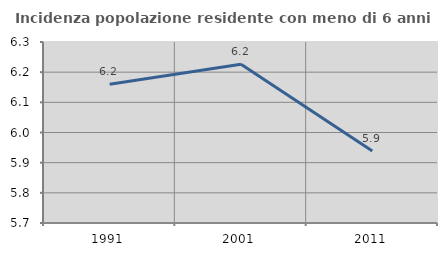
| Category | Incidenza popolazione residente con meno di 6 anni |
|---|---|
| 1991.0 | 6.16 |
| 2001.0 | 6.227 |
| 2011.0 | 5.938 |